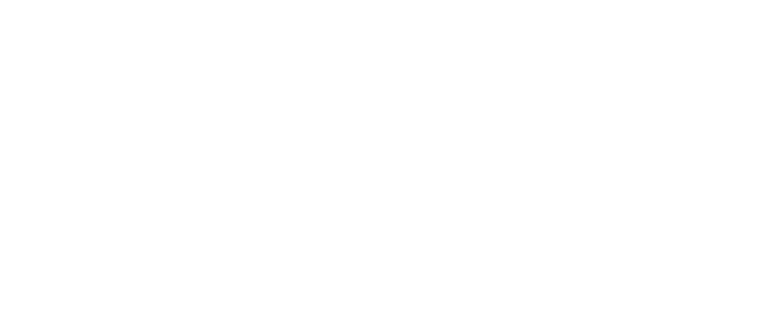
| Category | Series 0 | Series 1 | Series 2 |
|---|---|---|---|
| Herstellungskosten KG 300 | 0 |  |  |
| Herstellungskosten KG 400 | 0 |  |  |
| Barwert regelmäßige Zahlungen KG 300 | 0 |  |  |
| Barwert regelmäßige Zahlungen KG 400 | 0 |  |  |
| Barwert unregelmäßige Zahlungen KG 300 | 0 |  |  |
| Barwert unregelmäßige Zahlungen KG 400 | 0 |  |  |
| Barwert Nutzungskosten Wasser/ Abwasser | 0 |  |  |
| Barwert Nutzungskosten Energie | 0 |  |  |
| Barwert Nutzungskosten Reinigung | 0 |  |  |